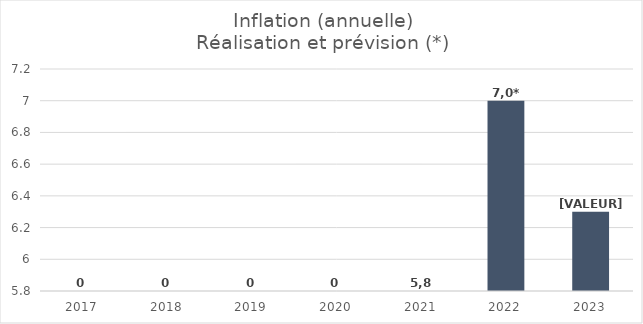
| Category |  Inflation  |
|---|---|
| 2017.0 | 0 |
| 2018.0 | 0 |
| 2019.0 | 0 |
| 2020.0 | 0 |
| 2021.0 | 0 |
| 2022.0 | 7 |
| 2023.0 | 6.3 |